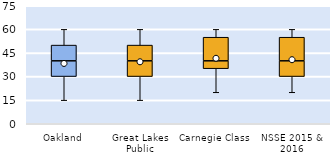
| Category | 25th | 50th | 75th |
|---|---|---|---|
| Oakland | 30 | 10 | 10 |
| Great Lakes Public | 30 | 10 | 10 |
| Carnegie Class | 35 | 5 | 15 |
| NSSE 2015 & 2016 | 30 | 10 | 15 |